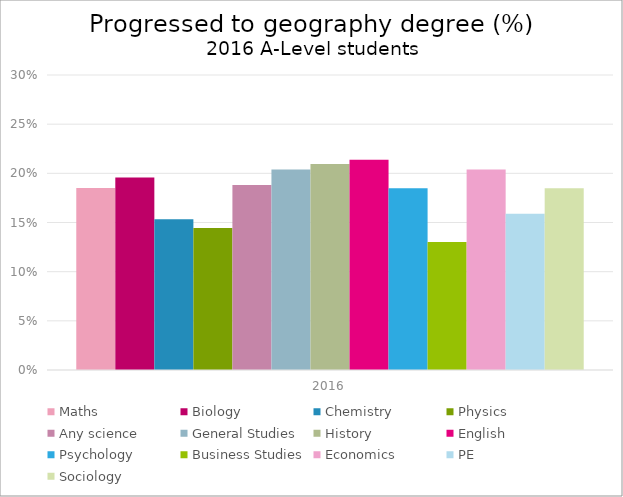
| Category | Maths | Biology | Chemistry | Physics | Any science | General Studies | History | English | Psychology | Business Studies | Economics | PE | Sociology |
|---|---|---|---|---|---|---|---|---|---|---|---|---|---|
| 2016.0 | 0.185 | 0.196 | 0.153 | 0.144 | 0.188 | 0.204 | 0.21 | 0.214 | 0.185 | 0.13 | 0.204 | 0.159 | 0.185 |